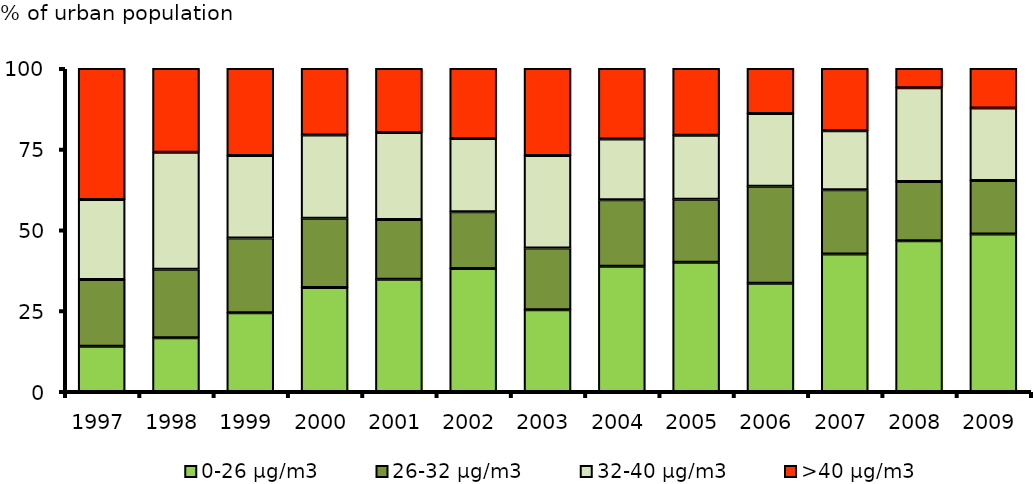
| Category | 0-26 μg/m3 | 26-32 μg/m3 | 32-40 μg/m3 | >40 μg/m3 |
|---|---|---|---|---|
| 1997.0 | 14.035 | 20.636 | 24.771 | 40.558 |
| 1998.0 | 16.655 | 21.177 | 36.211 | 25.957 |
| 1999.0 | 24.349 | 23.139 | 25.574 | 26.938 |
| 2000.0 | 32.164 | 21.488 | 25.756 | 20.592 |
| 2001.0 | 34.771 | 18.464 | 26.984 | 19.78 |
| 2002.0 | 38.059 | 17.584 | 22.662 | 21.696 |
| 2003.0 | 25.289 | 19.137 | 28.616 | 26.959 |
| 2004.0 | 38.81 | 20.577 | 18.762 | 21.852 |
| 2005.0 | 40.015 | 19.52 | 19.801 | 20.664 |
| 2006.0 | 33.55 | 29.973 | 22.527 | 13.95 |
| 2007.0 | 42.536 | 19.91 | 18.255 | 19.299 |
| 2008.0 | 46.693 | 18.333 | 29.02 | 5.954 |
| 2009.0 | 48.789 | 16.545 | 22.473 | 12.193 |